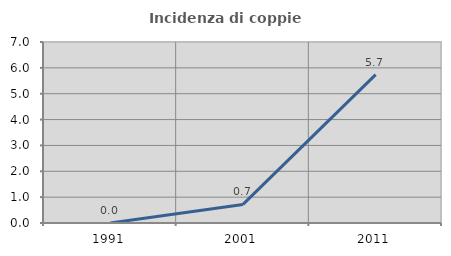
| Category | Incidenza di coppie miste |
|---|---|
| 1991.0 | 0 |
| 2001.0 | 0.719 |
| 2011.0 | 5.738 |